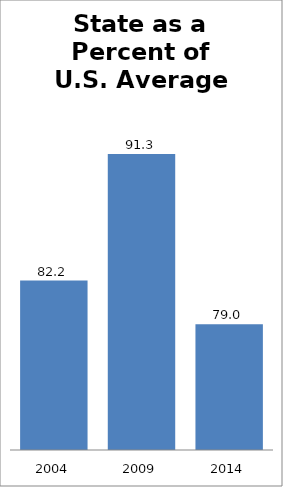
| Category | Series 0 |
|---|---|
| 2004.0 | 82.169 |
| 2009.0 | 91.273 |
| 2014.0 | 79.032 |